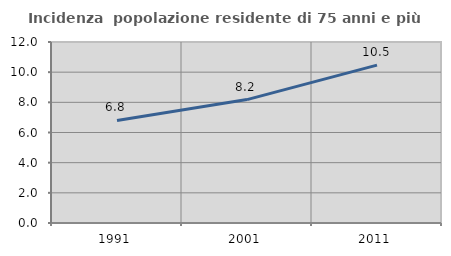
| Category | Incidenza  popolazione residente di 75 anni e più |
|---|---|
| 1991.0 | 6.798 |
| 2001.0 | 8.181 |
| 2011.0 | 10.464 |